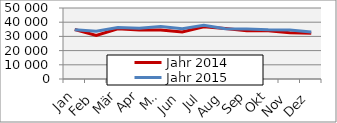
| Category | Jahr 2014 | Jahr 2015 |
|---|---|---|
| 0 | 34840.212 | 34677.359 |
| 1 | 30706.12 | 33705.398 |
| 2 | 35350.44 | 36339.655 |
| 3 | 34530.627 | 35700.422 |
| 4 | 34588.093 | 36884.359 |
| 5 | 33117.892 | 35436.765 |
| 6 | 36794.723 | 37851.692 |
| 7 | 35556.585 | 35333.539 |
| 8 | 33967.265 | 35238.295 |
| 9 | 34054.905 | 34653.799 |
| 10 | 32604.411 | 34511.486 |
| 11 | 32133.379 | 33037.458 |